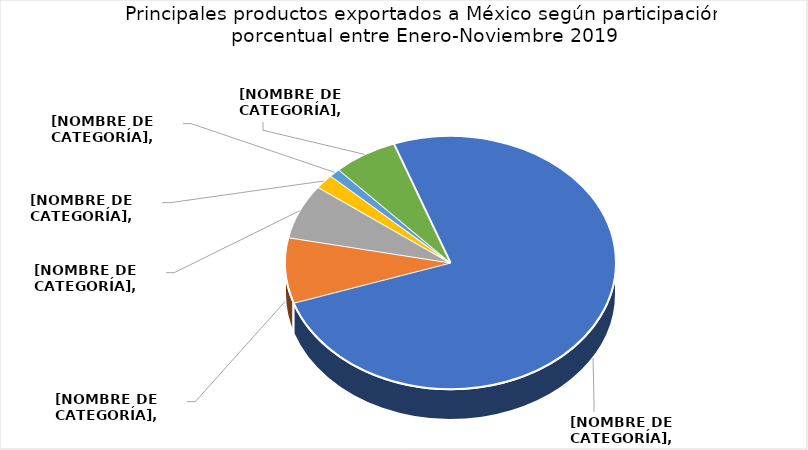
| Category | Series 0 |
|---|---|
| Aceite de palma y sus fracciones, en bruto. | 0.746 |
| Despojos comestibles de carne bovina, frescos o refrigerados. | 0.083 |
| Desperdicios y desechos, de aluminio. | 0.069 |
| Las demás disoluciones de pinturas | 0.019 |
| Rayas (Rajidae), en filetes, frescos o refrigerados | 0.011 |
| 21 productos restantes | 0.062 |